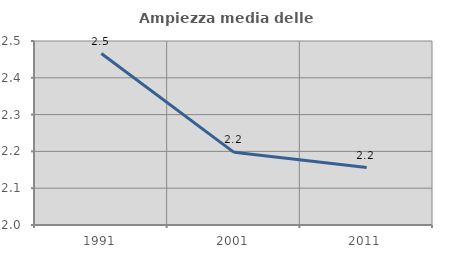
| Category | Ampiezza media delle famiglie |
|---|---|
| 1991.0 | 2.466 |
| 2001.0 | 2.197 |
| 2011.0 | 2.156 |